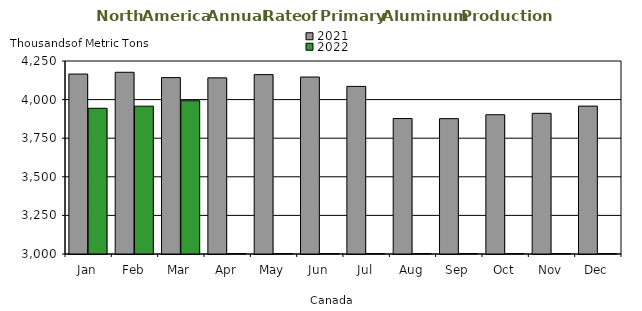
| Category | 2021 | 2022 |
|---|---|---|
| Jan | 4165.415 | 3943.766 |
| Feb | 4177.021 | 3957.421 |
| Mar | 4142.373 | 3992.464 |
| Apr | 4140.901 | 0 |
| May | 4161.765 | 0 |
| Jun | 4146.23 | 0 |
| Jul | 4085.539 | 0 |
| Aug | 3877.277 | 0 |
| Sep | 3876.75 | 0 |
| Oct | 3901.897 | 0 |
| Nov | 3911.17 | 0 |
| Dec | 3957.754 | 0 |